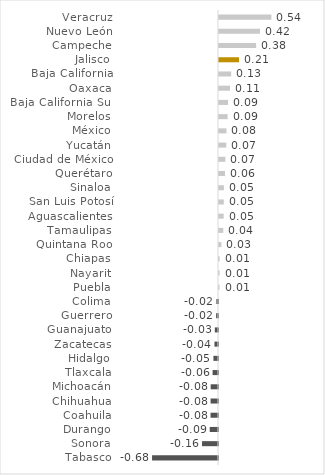
| Category | Series 0 |
|---|---|
| Tabasco | -0.68 |
| Sonora | -0.165 |
| Durango | -0.085 |
| Coahuila | -0.077 |
| Chihuahua | -0.077 |
| Michoacán | -0.076 |
| Tlaxcala | -0.056 |
| Hidalgo | -0.047 |
| Zacatecas | -0.037 |
| Guanajuato | -0.033 |
| Guerrero | -0.02 |
| Colima | -0.017 |
| Puebla | 0.005 |
| Nayarit | 0.006 |
| Chiapas | 0.007 |
| Quintana Roo | 0.025 |
| Tamaulipas | 0.044 |
| Aguascalientes | 0.048 |
| San Luis Potosí | 0.05 |
| Sinaloa | 0.05 |
| Querétaro | 0.062 |
| Ciudad de México | 0.066 |
| Yucatán | 0.075 |
| México | 0.077 |
| Morelos | 0.089 |
| Baja California Sur | 0.093 |
| Oaxaca | 0.113 |
| Baja California | 0.126 |
| Jalisco | 0.206 |
| Campeche | 0.383 |
| Nuevo León | 0.422 |
| Veracruz | 0.54 |